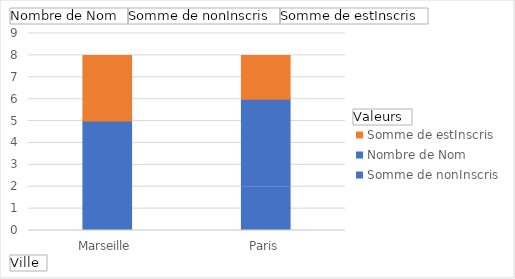
| Category | Somme de nonInscris | Nombre de Nom | Somme de estInscris |
|---|---|---|---|
| Marseille | 1 | 4 | 3 |
| Paris | 2 | 4 | 2 |